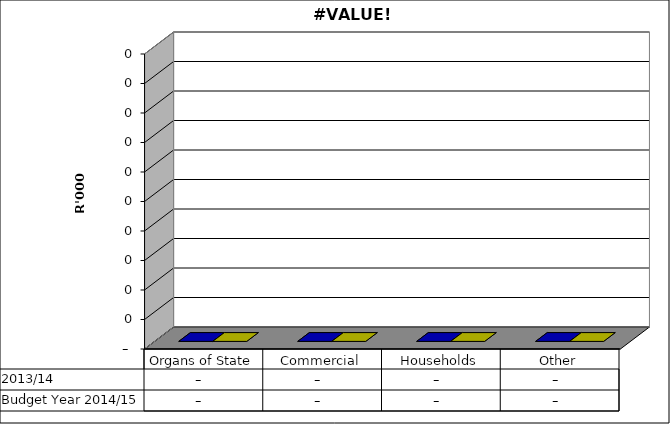
| Category |  2013/14  | Budget Year 2014/15 |
|---|---|---|
| Organs of State | 0 | 0 |
| Commercial | 0 | 0 |
| Households | 0 | 0 |
| Other | 0 | 0 |